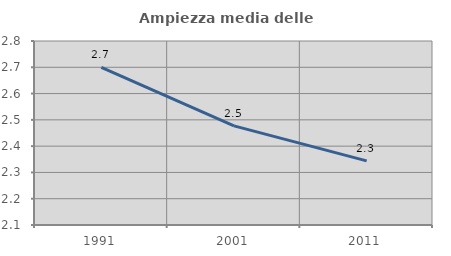
| Category | Ampiezza media delle famiglie |
|---|---|
| 1991.0 | 2.699 |
| 2001.0 | 2.477 |
| 2011.0 | 2.344 |